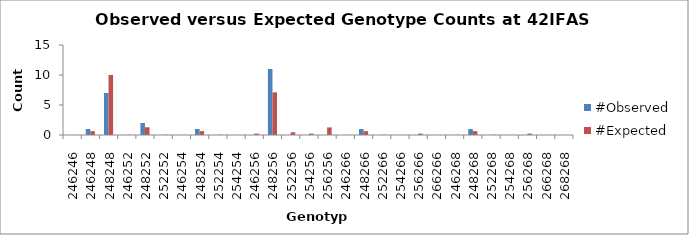
| Category | #Observed | #Expected |
|---|---|---|
| 246246.0 | 0 | 0.01 |
| 246248.0 | 1 | 0.646 |
| 248248.0 | 7 | 10.01 |
| 246252.0 | 0 | 0.042 |
| 248252.0 | 2 | 1.292 |
| 252252.0 | 0 | 0.042 |
| 246254.0 | 0 | 0.021 |
| 248254.0 | 1 | 0.646 |
| 252254.0 | 0 | 0.042 |
| 254254.0 | 0 | 0.01 |
| 246256.0 | 0 | 0.229 |
| 248256.0 | 11 | 7.104 |
| 252256.0 | 0 | 0.458 |
| 254256.0 | 0 | 0.229 |
| 256256.0 | 0 | 1.26 |
| 246266.0 | 0 | 0.021 |
| 248266.0 | 1 | 0.646 |
| 252266.0 | 0 | 0.042 |
| 254266.0 | 0 | 0.021 |
| 256266.0 | 0 | 0.229 |
| 266266.0 | 0 | 0.01 |
| 246268.0 | 0 | 0.021 |
| 248268.0 | 1 | 0.646 |
| 252268.0 | 0 | 0.042 |
| 254268.0 | 0 | 0.021 |
| 256268.0 | 0 | 0.229 |
| 266268.0 | 0 | 0.021 |
| 268268.0 | 0 | 0.01 |